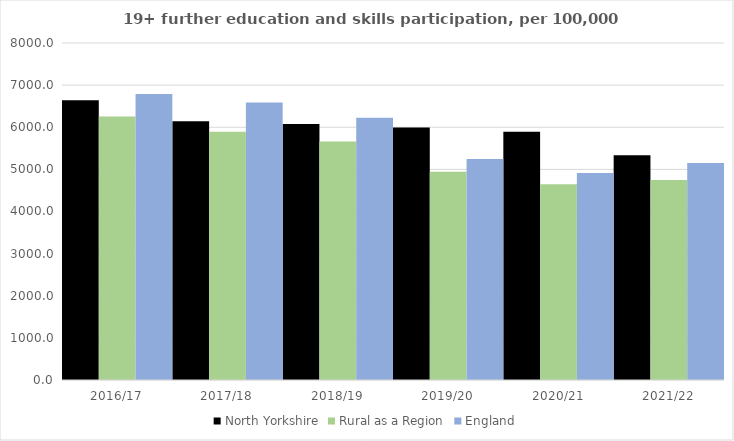
| Category | North Yorkshire | Rural as a Region | England |
|---|---|---|---|
| 2016/17 | 6643.106 | 6253.401 | 6788 |
| 2017/18 | 6141.209 | 5892.029 | 6588 |
| 2018/19 | 6078.92 | 5661.873 | 6227 |
| 2019/20 | 5991.786 | 4943.801 | 5244 |
| 2020/21 | 5892.191 | 4646.727 | 4913 |
| 2021/22 | 5337.836 | 4747.049 | 5151 |